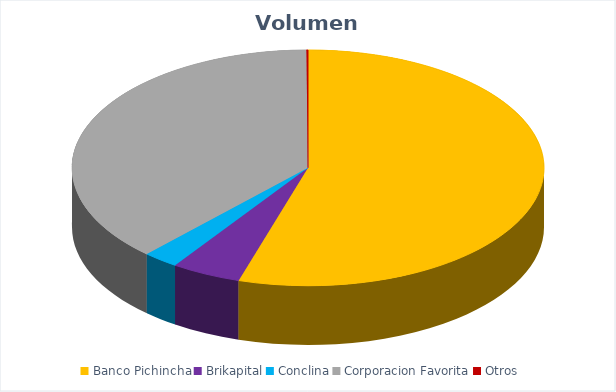
| Category | VOLUMEN ($USD) |
|---|---|
| Banco Pichincha | 126280 |
| Brikapital | 11000 |
| Conclina | 5640 |
| Corporacion Favorita | 87499.33 |
| Otros | 254.4 |